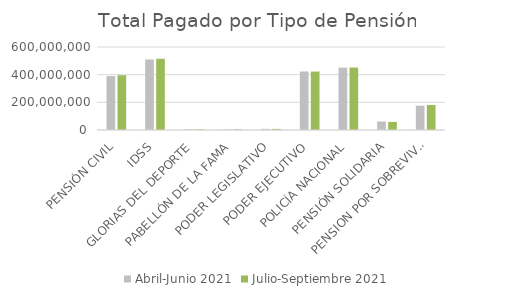
| Category | Abril-Junio 2021 | Julio-Septiembre 2021 |
|---|---|---|
| PENSIÓN CIVIL | 389857979.25 | 395798200.03 |
| IDSS | 510211625.12 | 514655292.12 |
| GLORIAS DEL DEPORTE | 4655585.25 | 4588034.25 |
| PABELLÓN DE LA FAMA | 4673660.11 | 4769926.35 |
| PODER LEGISLATIVO | 8135102.07 | 7859081.68 |
| PODER EJECUTIVO | 423175892.01 | 422264407.26 |
| POLICÍA NACIONAL | 450900872 | 451598843.05 |
| PENSIÓN SOLIDARIA | 61002000 | 58518000 |
| PENSION POR SOBREVIVENCIA | 175881784.37 | 181019721.69 |